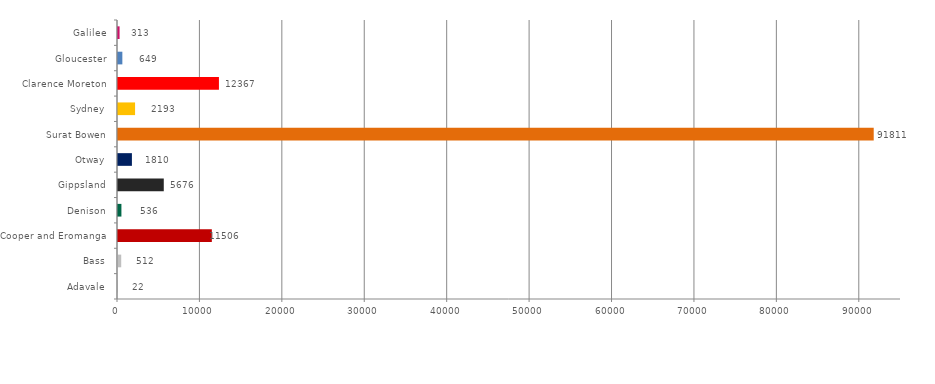
| Category | Series 0 |
|---|---|
| Adavale | 21.53 |
| Bass | 511.903 |
| Cooper and Eromanga | 11505.603 |
| Denison | 535.7 |
| Gippsland | 5675.574 |
| Otway | 1809.6 |
| Surat Bowen | 91811.3 |
| Sydney | 2192.52 |
| Clarence Moreton | 12367 |
| Gloucester | 649 |
| Galilee | 313 |